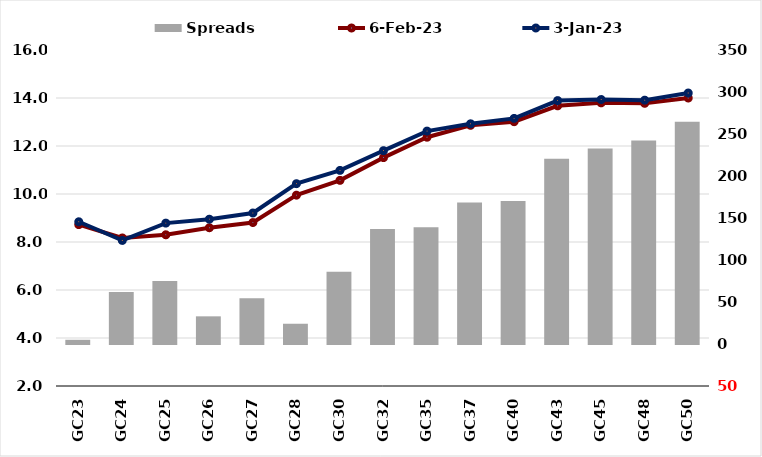
| Category |  Spreads   |
|---|---|
| GC23 | 5.021 |
| GC24 | 61.822 |
| GC25 | 75.059 |
| GC26 | 32.935 |
| GC27 | 54.556 |
| GC28 | 24.116 |
| GC30 | 85.864 |
| GC32 | 136.986 |
| GC35 | 139.048 |
| GC37 | 168.569 |
| GC40 | 170.276 |
| GC43 | 220.413 |
| GC45 | 232.719 |
| GC48 | 242.39 |
| GC50 | 264.491 |